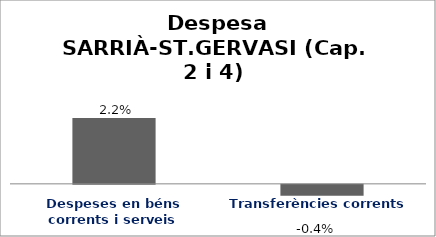
| Category | Series 0 |
|---|---|
| Despeses en béns corrents i serveis | 0.022 |
| Transferències corrents | -0.004 |